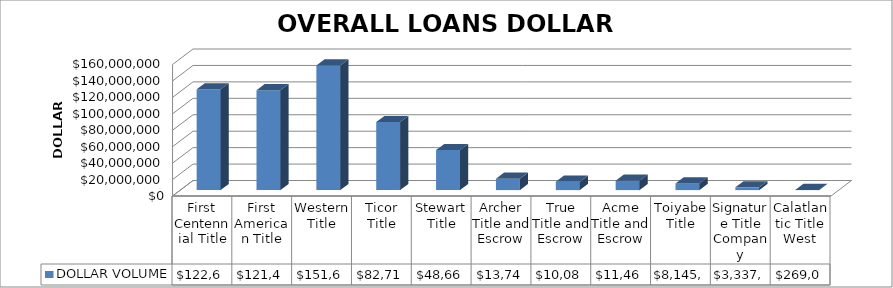
| Category | DOLLAR VOLUME |
|---|---|
| First Centennial Title | 122606356 |
| First American Title | 121495336.17 |
| Western Title | 151671756 |
| Ticor Title | 82717282 |
| Stewart Title | 48667806 |
| Archer Title and Escrow | 13746542 |
| True Title and Escrow | 10084988 |
| Acme Title and Escrow | 11461408 |
| Toiyabe Title | 8145795 |
| Signature Title Company | 3337598 |
| Calatlantic Title West | 269000 |